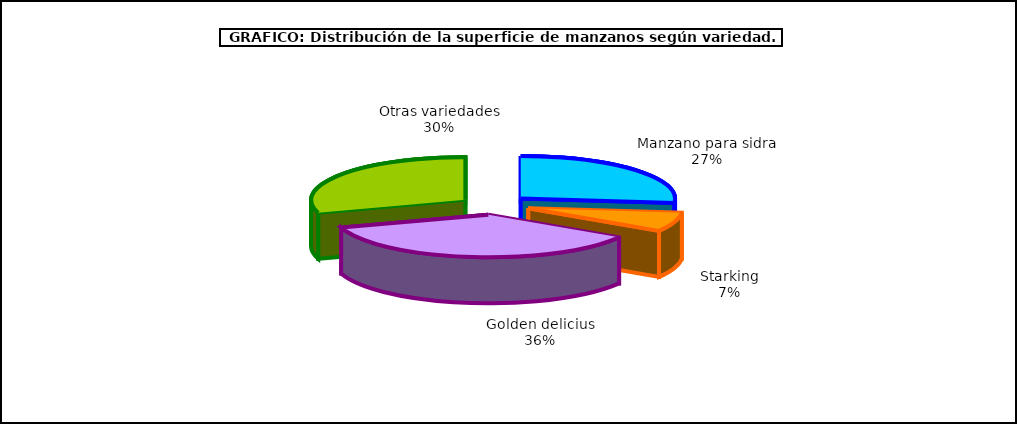
| Category | superficie |
|---|---|
| 0 | 8.226 |
| 1 | 2.245 |
| 2 | 11.179 |
| 3 | 9.225 |